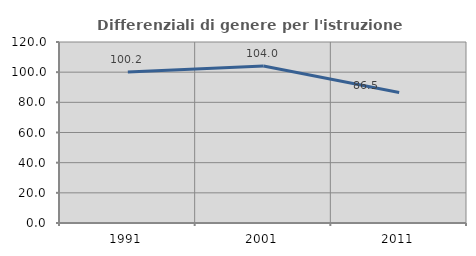
| Category | Differenziali di genere per l'istruzione superiore |
|---|---|
| 1991.0 | 100.16 |
| 2001.0 | 104.046 |
| 2011.0 | 86.476 |